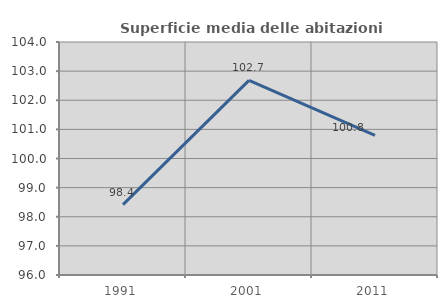
| Category | Superficie media delle abitazioni occupate |
|---|---|
| 1991.0 | 98.416 |
| 2001.0 | 102.684 |
| 2011.0 | 100.796 |